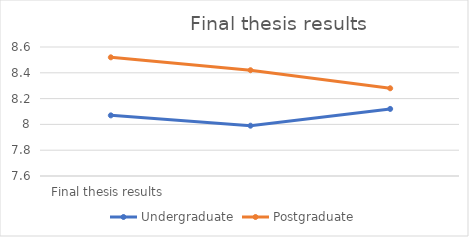
| Category | Undergraduate | Postgraduate |
|---|---|---|
| Final thesis results | 8.07 | 8.52 |